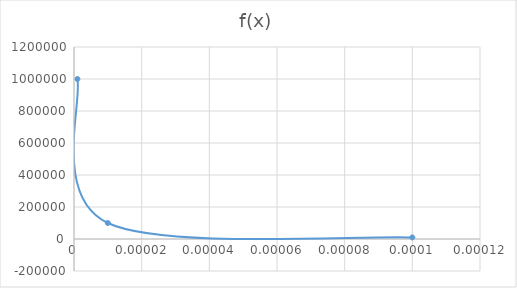
| Category | f(x) |
|---|---|
| 0.0001 | 10000 |
| 1e-05 | 100000 |
| 1e-06 | 1000000 |